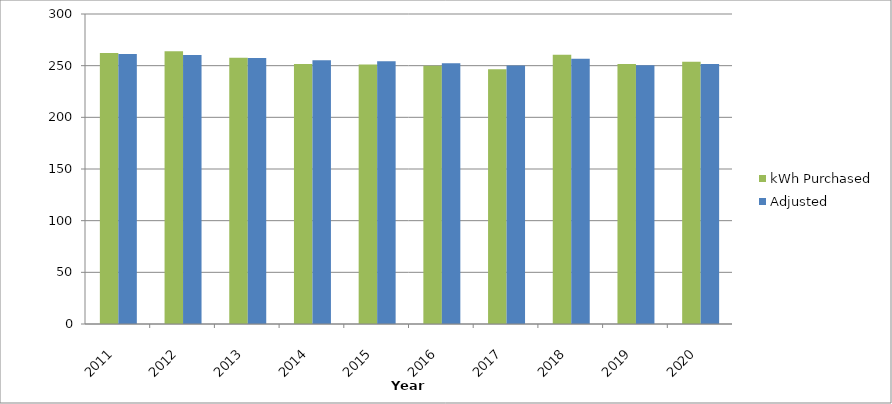
| Category | kWh Purchased | Adjusted |
|---|---|---|
| 2011.0 | 262348777 | 261227143.881 |
| 2012.0 | 264024090.47 | 260296369.414 |
| 2013.0 | 257694736.89 | 257377848.781 |
| 2014.0 | 251596754.59 | 255297995.695 |
| 2015.0 | 251243247.39 | 254181595.148 |
| 2016.0 | 249993948.39 | 252402448.642 |
| 2017.0 | 246516908.07 | 250061423.214 |
| 2018.0 | 260643732.65 | 256617890.658 |
| 2019.0 | 251604521.3 | 250380905.402 |
| 2020.0 | 253882042.167 | 251705138.081 |